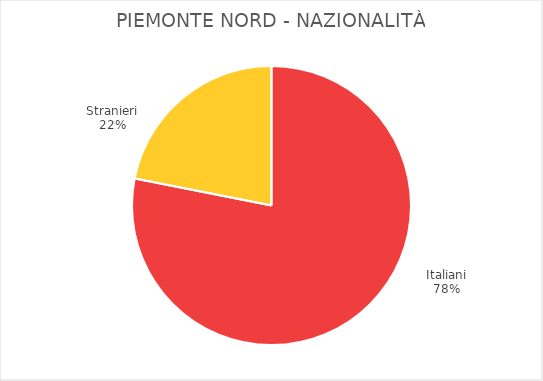
| Category | Piemonte Nord |
|---|---|
| Italiani | 34683 |
| Stranieri | 9725 |